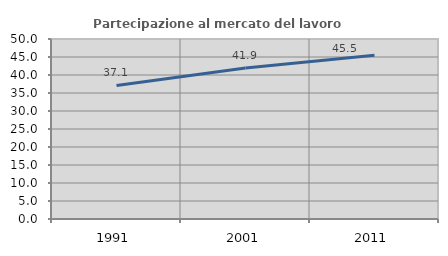
| Category | Partecipazione al mercato del lavoro  femminile |
|---|---|
| 1991.0 | 37.107 |
| 2001.0 | 41.92 |
| 2011.0 | 45.455 |